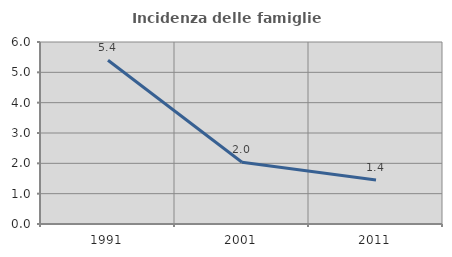
| Category | Incidenza delle famiglie numerose |
|---|---|
| 1991.0 | 5.401 |
| 2001.0 | 2.036 |
| 2011.0 | 1.447 |